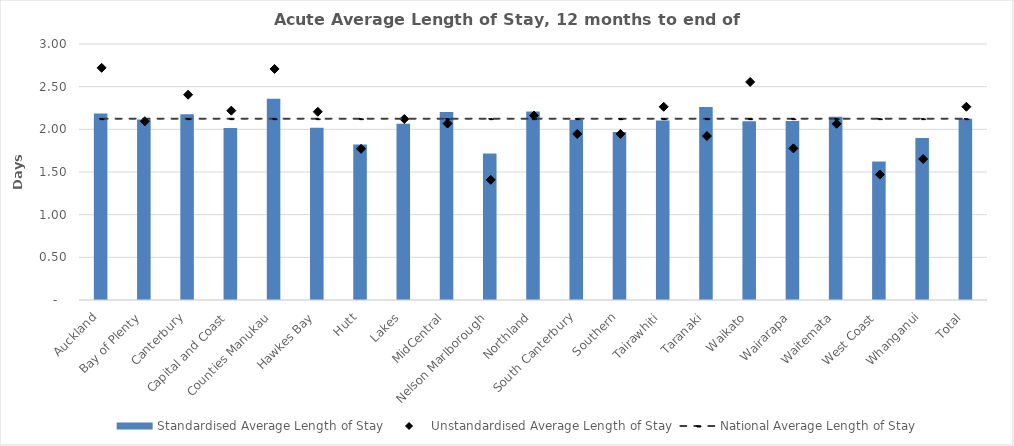
| Category | Standardised Average Length of Stay |
|---|---|
| Auckland | 2.187 |
| Bay of Plenty | 2.116 |
| Canterbury | 2.178 |
| Capital and Coast | 2.015 |
| Counties Manukau | 2.358 |
| Hawkes Bay | 2.018 |
| Hutt | 1.823 |
| Lakes | 2.066 |
| MidCentral | 2.202 |
| Nelson Marlborough | 1.715 |
| Northland | 2.209 |
| South Canterbury | 2.112 |
| Southern | 1.968 |
| Tairawhiti | 2.105 |
| Taranaki | 2.263 |
| Waikato | 2.093 |
| Wairarapa | 2.098 |
| Waitemata | 2.148 |
| West Coast | 1.623 |
| Whanganui | 1.898 |
| Total | 2.125 |